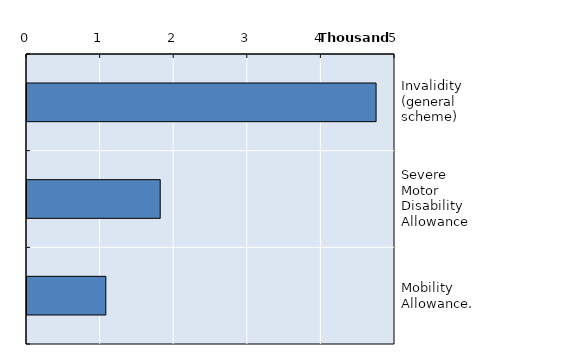
| Category | Series 0 |
|---|---|
| Invalidity (general scheme) | 4743 |
| Severe Motor Disability Allowance | 1810 |
| Mobility Allowance. | 1071 |